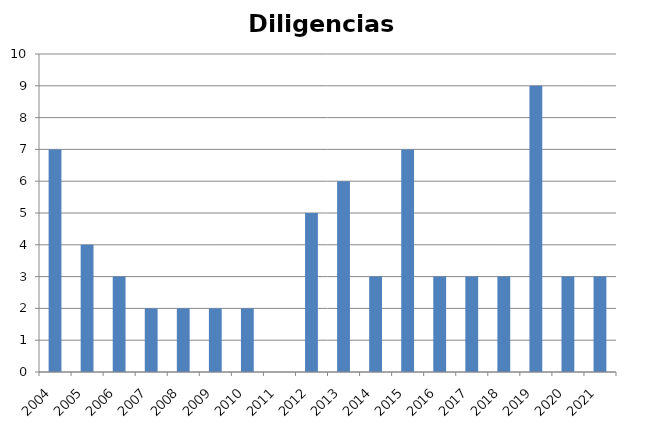
| Category | Diligencias Informativas |
|---|---|
| 2004.0 | 7 |
| 2005.0 | 4 |
| 2006.0 | 3 |
| 2007.0 | 2 |
| 2008.0 | 2 |
| 2009.0 | 2 |
| 2010.0 | 2 |
| 2011.0 | 0 |
| 2012.0 | 5 |
| 2013.0 | 6 |
| 2014.0 | 3 |
| 2015.0 | 7 |
| 2016.0 | 3 |
| 2017.0 | 3 |
| 2018.0 | 3 |
| 2019.0 | 9 |
| 2020.0 | 3 |
| 2021.0 | 3 |